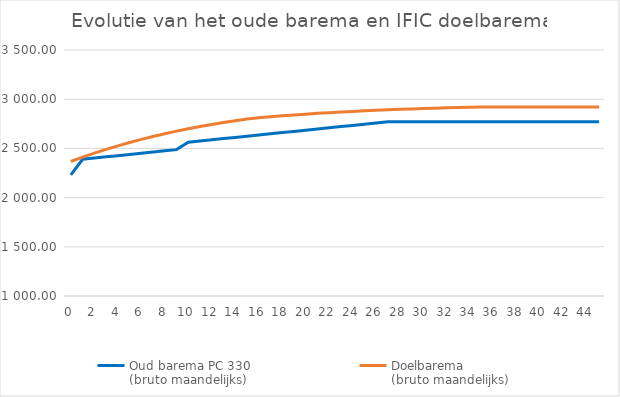
| Category | Oud barema PC 330 
(bruto maandelijks) | Doelbarema | Doelbarema 
(bruto maandelijks) |
|---|---|---|---|
| 0.0 | 2230.47 |  | 2367.17 |
| 1.0 | 2389.7 |  | 2410.6 |
| 2.0 | 2401.93 |  | 2451.51 |
| 3.0 | 2414.15 |  | 2490 |
| 4.0 | 2426.37 |  | 2526.15 |
| 5.0 | 2438.6 |  | 2560.09 |
| 6.0 | 2450.82 |  | 2591.89 |
| 7.0 | 2463.04 |  | 2621.67 |
| 8.0 | 2475.27 |  | 2649.54 |
| 9.0 | 2487.5 |  | 2675.59 |
| 10.0 | 2562.77 |  | 2699.92 |
| 11.0 | 2574.99 |  | 2722.64 |
| 12.0 | 2587.21 |  | 2743.81 |
| 13.0 | 2599.44 |  | 2763.56 |
| 14.0 | 2611.66 |  | 2781.96 |
| 15.0 | 2623.89 |  | 2799.09 |
| 16.0 | 2636.11 |  | 2810.42 |
| 17.0 | 2648.34 |  | 2820.94 |
| 18.0 | 2660.56 |  | 2830.7 |
| 19.0 | 2672.79 |  | 2839.76 |
| 20.0 | 2685.01 |  | 2848.18 |
| 21.0 | 2697.24 |  | 2855.98 |
| 22.0 | 2709.46 |  | 2863.21 |
| 23.0 | 2721.69 |  | 2869.93 |
| 24.0 | 2733.91 |  | 2876.16 |
| 25.0 | 2746.14 |  | 2881.93 |
| 26.0 | 2758.36 |  | 2887.27 |
| 27.0 | 2770.59 |  | 2892.22 |
| 28.0 | 2770.59 |  | 2896.82 |
| 29.0 | 2770.59 |  | 2901.08 |
| 30.0 | 2770.59 |  | 2905.02 |
| 31.0 | 2770.59 |  | 2908.66 |
| 32.0 | 2770.59 |  | 2912.04 |
| 33.0 | 2770.59 |  | 2915.18 |
| 34.0 | 2770.59 |  | 2918.07 |
| 35.0 | 2770.59 |  | 2920.76 |
| 36.0 | 2770.59 |  | 2920.76 |
| 37.0 | 2770.59 |  | 2920.76 |
| 38.0 | 2770.59 |  | 2920.76 |
| 39.0 | 2770.59 |  | 2920.76 |
| 40.0 | 2770.59 |  | 2920.76 |
| 41.0 | 2770.59 |  | 2920.76 |
| 42.0 | 2770.59 |  | 2920.76 |
| 43.0 | 2770.59 |  | 2920.76 |
| 44.0 | 2770.59 |  | 2920.76 |
| 45.0 | 2770.59 |  | 2920.76 |